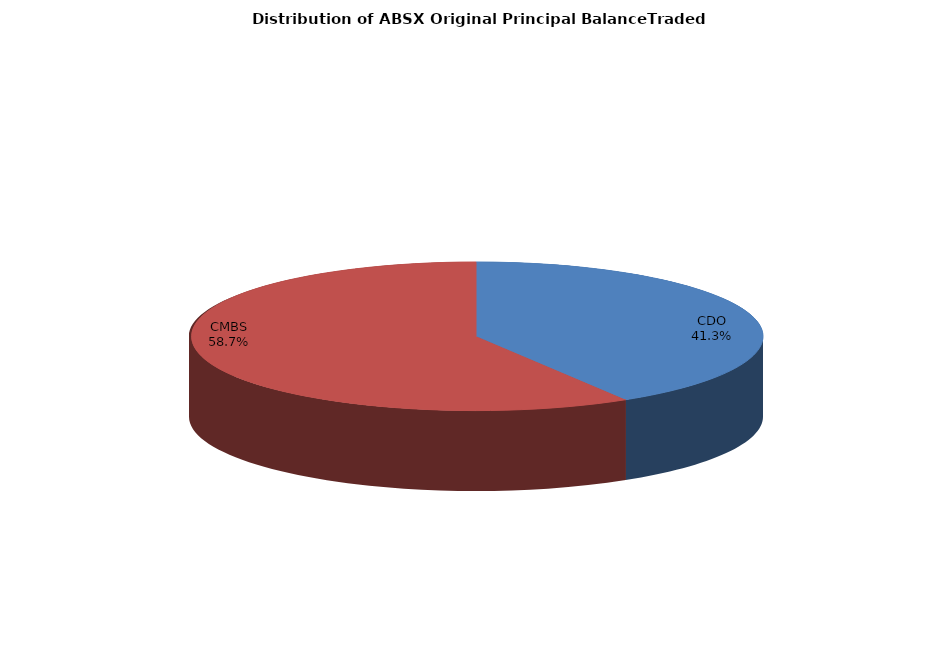
| Category | Series 0 |
|---|---|
| CDO | 1367911444.612 |
| CMBS | 1946895334.184 |